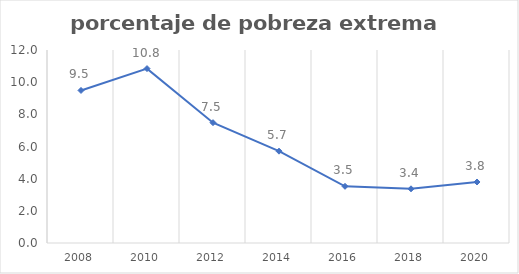
| Category | Series 0 |
|---|---|
| 2008.0 | 9.486 |
| 2010.0 | 10.843 |
| 2012.0 | 7.481 |
| 2014.0 | 5.71 |
| 2016.0 | 3.524 |
| 2018.0 | 3.369 |
| 2020.0 | 3.794 |